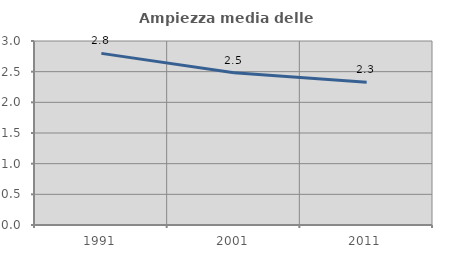
| Category | Ampiezza media delle famiglie |
|---|---|
| 1991.0 | 2.798 |
| 2001.0 | 2.483 |
| 2011.0 | 2.327 |